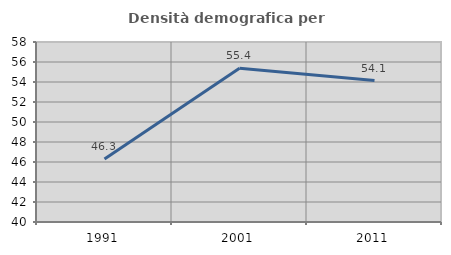
| Category | Densità demografica |
|---|---|
| 1991.0 | 46.3 |
| 2001.0 | 55.364 |
| 2011.0 | 54.139 |